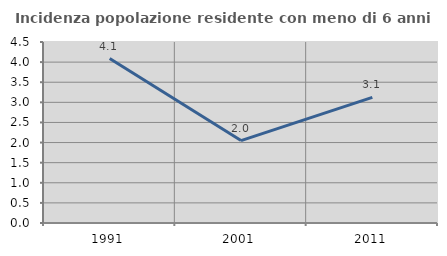
| Category | Incidenza popolazione residente con meno di 6 anni |
|---|---|
| 1991.0 | 4.089 |
| 2001.0 | 2.049 |
| 2011.0 | 3.125 |